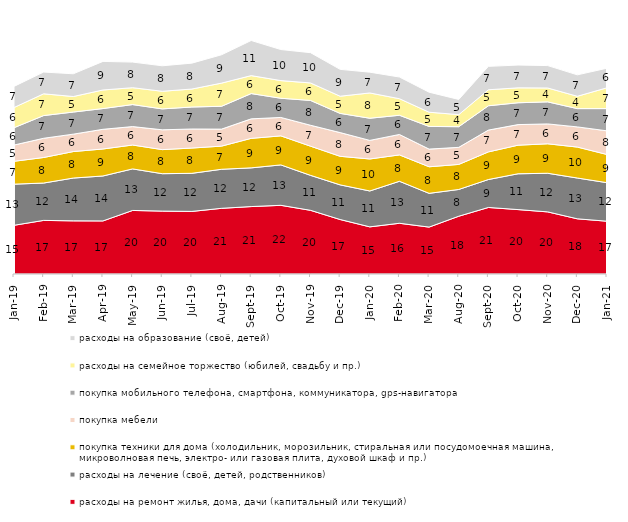
| Category | расходы на ремонт жилья, дома, дачи (капитальный или текущий) | расходы на лечение (своё, детей, родственников) | покупка техники для дома (холодильник, морозильник, стиральная или посудомоечная машина, микроволновая печь, электро- или газовая плита, духовой шкаф и пр.) | покупка мебели | покупка мобильного телефона, смартфона, коммуникатора, gps-навигатора | расходы на семейное торжество (юбилей, свадьбу и пр.) | расходы на образование (своё, детей) |
|---|---|---|---|---|---|---|---|
| 2019-01-01 | 15.45 | 13.05 | 7.25 | 5.15 | 5.5 | 6.4 | 6.7 |
| 2019-02-01 | 17 | 11.85 | 8.1 | 6.1 | 7.2 | 6.9 | 6.9 |
| 2019-03-01 | 16.857 | 13.575 | 8.404 | 5.52 | 7.011 | 4.923 | 7.21 |
| 2019-04-01 | 16.832 | 14.257 | 8.564 | 6.238 | 6.584 | 5.891 | 9.059 |
| 2019-05-01 | 20.158 | 13.175 | 7.578 | 5.844 | 6.984 | 5.349 | 8.123 |
| 2019-06-01 | 19.95 | 11.87 | 7.631 | 6.284 | 6.633 | 5.586 | 8.08 |
| 2019-07-01 | 19.851 | 12.079 | 8.02 | 6.04 | 6.98 | 5.693 | 8.218 |
| 2019-08-01 | 20.829 | 12.388 | 7.343 | 5.395 | 7.243 | 7.343 | 8.991 |
| 2019-09-01 | 21.386 | 12.277 | 9.356 | 6.188 | 8.02 | 5.693 | 11.139 |
| 2019-10-01 | 21.782 | 12.822 | 9.208 | 5.842 | 6.089 | 5.594 | 9.851 |
| 2019-11-01 | 20.198 | 11.089 | 9.257 | 6.634 | 7.871 | 5.545 | 9.604 |
| 2019-12-01 | 17.277 | 10.99 | 9.059 | 7.525 | 6.089 | 5.446 | 8.515 |
| 2020-01-01 | 14.95 | 11.386 | 10.149 | 5.891 | 7.03 | 8.02 | 6.584 |
| 2020-02-01 | 16.089 | 13.317 | 8.366 | 6.485 | 6.089 | 5.248 | 6.881 |
| 2020-03-01 | 14.874 | 10.709 | 8.428 | 5.602 | 7.189 | 4.512 | 6.346 |
| 2020-08-01 | 18.322 | 8.491 | 7.944 | 5.412 | 6.554 | 3.823 | 4.816 |
| 2020-09-01 | 21.105 | 8.86 | 8.761 | 6.919 | 7.715 | 5.077 | 7.417 |
| 2020-10-01 | 20.428 | 11.36 | 9.068 | 6.527 | 6.926 | 4.733 | 7.225 |
| 2020-11-01 | 19.7 | 12.25 | 9.35 | 6.3 | 7 | 4.4 | 7.1 |
| 2020-12-01 | 17.501 | 12.94 | 9.817 | 6.396 | 5.801 | 3.917 | 6.792 |
| 2021-01-01 | 16.741 | 12.221 | 8.942 | 7.501 | 7.054 | 6.607 | 6.21 |